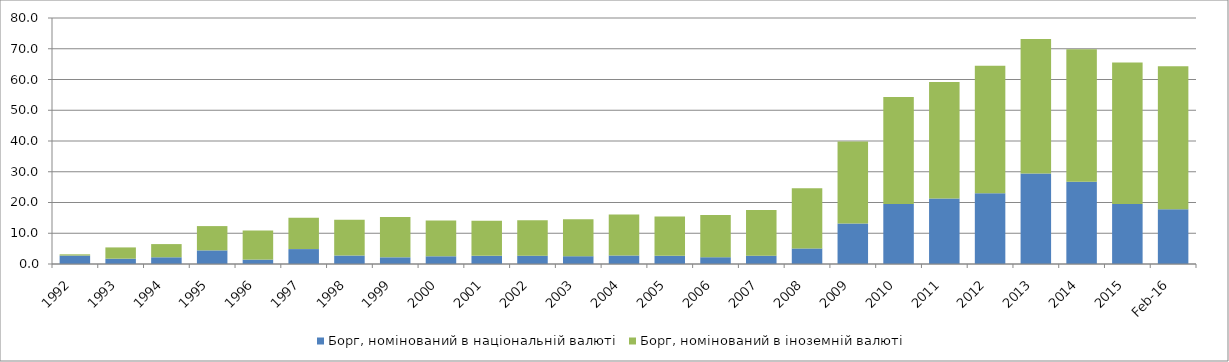
| Category | Борг, номінований в національній валюті | Борг, номінований в іноземній валюті |
|---|---|---|
| 1992.0 | 2.743 | 0.404 |
| 1993.0 | 1.732 | 3.661 |
| 1994.0 | 2.184 | 4.292 |
| 1995.0 | 4.433 | 7.895 |
| 1996.0 | 1.427 | 9.468 |
| 1997.0 | 4.845 | 10.164 |
| 1998.0 | 2.759 | 11.647 |
| 1999.0 | 2.176 | 13.072 |
| 2000.0 | 2.507 | 11.657 |
| 2001.0 | 2.65 | 11.419 |
| 2002.0 | 2.694 | 11.508 |
| 2003.0 | 2.533 | 12.01 |
| 2004.0 | 2.766 | 13.331 |
| 2005.0 | 2.666 | 12.809 |
| 2006.0 | 2.205 | 13.745 |
| 2007.0 | 2.69 | 14.883 |
| 2008.0 | 5.06 | 19.539 |
| 2009.0 | 13.143 | 26.67 |
| 2010.0 | 19.538 | 34.76 |
| 2011.0 | 21.329 | 37.894 |
| 2012.0 | 23.046 | 41.449 |
| 2013.0 | 29.397 | 43.765 |
| 2014.0 | 26.747 | 43.065 |
| 2015.0 | 19.515 | 45.99 |
| 42429.0 | 17.771 | 46.578 |